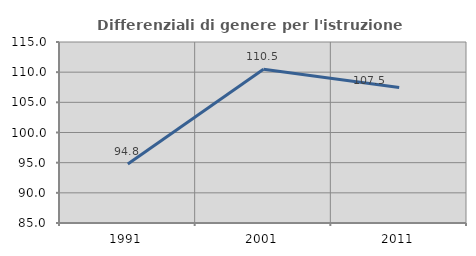
| Category | Differenziali di genere per l'istruzione superiore |
|---|---|
| 1991.0 | 94.767 |
| 2001.0 | 110.486 |
| 2011.0 | 107.451 |